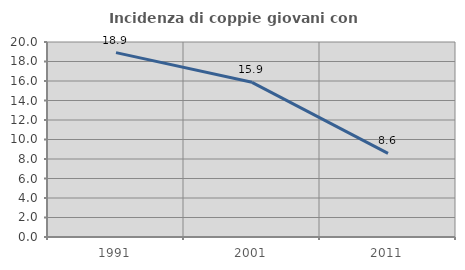
| Category | Incidenza di coppie giovani con figli |
|---|---|
| 1991.0 | 18.907 |
| 2001.0 | 15.867 |
| 2011.0 | 8.576 |